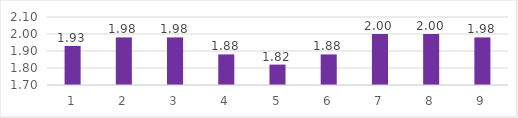
| Category | Series 0 |
|---|---|
| 0 | 1.93 |
| 1 | 1.98 |
| 2 | 1.98 |
| 3 | 1.88 |
| 4 | 1.82 |
| 5 | 1.88 |
| 6 | 2 |
| 7 | 2 |
| 8 | 1.98 |